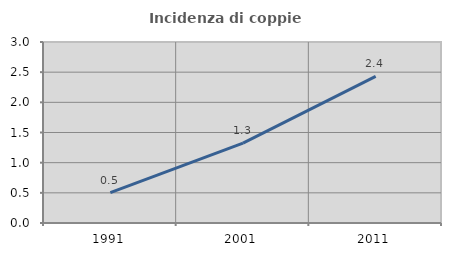
| Category | Incidenza di coppie miste |
|---|---|
| 1991.0 | 0.505 |
| 2001.0 | 1.324 |
| 2011.0 | 2.43 |